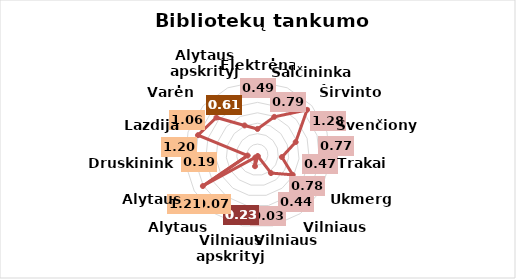
| Category | Series 0 |
|---|---|
| Elektrėnai | 0.49 |
| Šalčininkai | 0.79 |
| Širvintos | 1.28 |
| Švenčionys | 0.77 |
| Trakai | 0.47 |
| Ukmergė | 0.78 |
| Vilniaus r. | 0.44 |
| Vilniaus m. | 0.03 |
| Vilniaus apskrityje | 0.23 |
| Alytaus m. | 0.07 |
| Alytaus r. | 1.21 |
| Druskininkai | 0.19 |
| Lazdijai | 1.2 |
| Varėna | 1.06 |
| Alytaus apskrityje | 0.61 |